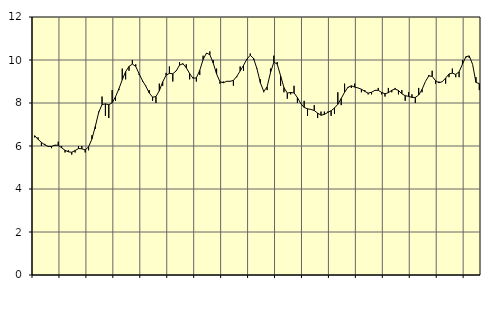
| Category | Piggar | Series 1 |
|---|---|---|
| nan | 6.4 | 6.48 |
| 87.0 | 6.4 | 6.31 |
| 87.0 | 6 | 6.17 |
| 87.0 | 6.1 | 6.05 |
| nan | 6 | 5.98 |
| 88.0 | 5.9 | 5.98 |
| 88.0 | 6 | 6.04 |
| 88.0 | 6.2 | 6.03 |
| nan | 6 | 5.92 |
| 89.0 | 5.7 | 5.8 |
| 89.0 | 5.8 | 5.73 |
| 89.0 | 5.6 | 5.71 |
| nan | 5.7 | 5.79 |
| 90.0 | 6 | 5.88 |
| 90.0 | 6 | 5.87 |
| 90.0 | 5.7 | 5.82 |
| nan | 5.8 | 5.96 |
| 91.0 | 6.5 | 6.33 |
| 91.0 | 6.8 | 6.91 |
| 91.0 | 7.6 | 7.56 |
| nan | 8.3 | 7.93 |
| 92.0 | 7.4 | 7.96 |
| 92.0 | 7.3 | 7.92 |
| 92.0 | 8.6 | 8.01 |
| nan | 8.1 | 8.29 |
| 93.0 | 8.6 | 8.66 |
| 93.0 | 9.6 | 9.08 |
| 93.0 | 9.1 | 9.46 |
| nan | 9.5 | 9.7 |
| 94.0 | 10 | 9.81 |
| 94.0 | 9.8 | 9.7 |
| 94.0 | 9.3 | 9.36 |
| nan | 9 | 9.04 |
| 95.0 | 8.8 | 8.78 |
| 95.0 | 8.6 | 8.47 |
| 95.0 | 8.1 | 8.27 |
| nan | 8 | 8.3 |
| 96.0 | 8.9 | 8.57 |
| 96.0 | 8.8 | 8.98 |
| 96.0 | 9.4 | 9.29 |
| nan | 9.7 | 9.38 |
| 97.0 | 9 | 9.36 |
| 97.0 | 9.5 | 9.49 |
| 97.0 | 9.9 | 9.76 |
| nan | 9.8 | 9.83 |
| 98.0 | 9.8 | 9.64 |
| 98.0 | 9.1 | 9.37 |
| 98.0 | 9.2 | 9.15 |
| nan | 9 | 9.17 |
| 99.0 | 9.3 | 9.52 |
| 99.0 | 10.2 | 10.02 |
| 99.0 | 10.3 | 10.32 |
| nan | 10.4 | 10.25 |
| 0.0 | 10 | 9.86 |
| 0.0 | 9.6 | 9.35 |
| 0.0 | 8.9 | 8.99 |
| nan | 9 | 8.94 |
| 1.0 | 9 | 9.01 |
| 1.0 | 9 | 9.01 |
| 1.0 | 8.8 | 9.05 |
| nan | 9.2 | 9.24 |
| 2.0 | 9.7 | 9.49 |
| 2.0 | 9.5 | 9.75 |
| 2.0 | 10 | 10.04 |
| nan | 10.3 | 10.22 |
| 3.0 | 10 | 10.07 |
| 3.0 | 9.6 | 9.58 |
| 3.0 | 9.1 | 8.94 |
| nan | 8.5 | 8.54 |
| 4.0 | 8.6 | 8.75 |
| 4.0 | 9.6 | 9.41 |
| 4.0 | 10.2 | 9.9 |
| nan | 9.9 | 9.81 |
| 5.0 | 8.8 | 9.27 |
| 5.0 | 8.5 | 8.72 |
| 5.0 | 8.2 | 8.46 |
| nan | 8.4 | 8.49 |
| 6.0 | 8.8 | 8.47 |
| 6.0 | 8 | 8.25 |
| 6.0 | 8 | 7.98 |
| nan | 8.1 | 7.79 |
| 7.0 | 7.4 | 7.73 |
| 7.0 | 7.7 | 7.7 |
| 7.0 | 7.9 | 7.65 |
| nan | 7.3 | 7.53 |
| 8.0 | 7.6 | 7.43 |
| 8.0 | 7.6 | 7.47 |
| 8.0 | 7.6 | 7.56 |
| nan | 7.4 | 7.64 |
| 9.0 | 7.5 | 7.77 |
| 9.0 | 8.5 | 7.94 |
| 9.0 | 7.9 | 8.21 |
| nan | 8.9 | 8.5 |
| 10.0 | 8.7 | 8.73 |
| 10.0 | 8.7 | 8.8 |
| 10.0 | 8.9 | 8.74 |
| nan | 8.7 | 8.7 |
| 11.0 | 8.5 | 8.64 |
| 11.0 | 8.6 | 8.54 |
| 11.0 | 8.4 | 8.46 |
| nan | 8.4 | 8.5 |
| 12.0 | 8.6 | 8.59 |
| 12.0 | 8.7 | 8.59 |
| 12.0 | 8.4 | 8.49 |
| nan | 8.3 | 8.43 |
| 13.0 | 8.7 | 8.48 |
| 13.0 | 8.5 | 8.59 |
| 13.0 | 8.7 | 8.65 |
| nan | 8.4 | 8.58 |
| 14.0 | 8.6 | 8.43 |
| 14.0 | 8.1 | 8.34 |
| 14.0 | 8.5 | 8.31 |
| nan | 8.4 | 8.26 |
| 15.0 | 8 | 8.26 |
| 15.0 | 8.7 | 8.37 |
| 15.0 | 8.5 | 8.63 |
| nan | 9 | 9 |
| 16.0 | 9.3 | 9.26 |
| 16.0 | 9.5 | 9.24 |
| 16.0 | 8.9 | 9.04 |
| nan | 9 | 8.94 |
| 17.0 | 9 | 8.99 |
| 17.0 | 8.9 | 9.16 |
| 17.0 | 9.2 | 9.35 |
| nan | 9.6 | 9.39 |
| 18.0 | 9.2 | 9.33 |
| 18.0 | 9.2 | 9.45 |
| 18.0 | 10 | 9.81 |
| nan | 10.1 | 10.15 |
| 19.0 | 10.1 | 10.19 |
| 19.0 | 9.8 | 9.8 |
| 19.0 | 9.2 | 8.96 |
| nan | 8.6 | 8.9 |